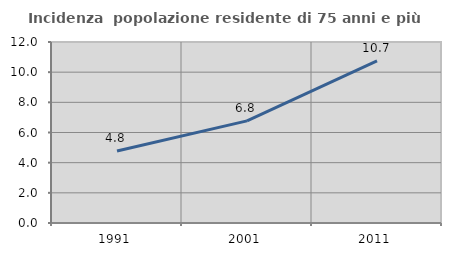
| Category | Incidenza  popolazione residente di 75 anni e più |
|---|---|
| 1991.0 | 4.777 |
| 2001.0 | 6.77 |
| 2011.0 | 10.745 |